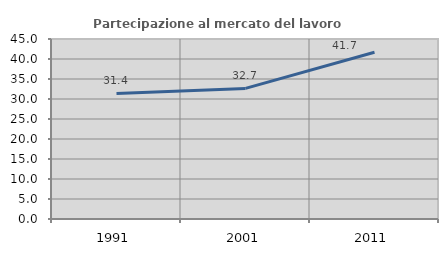
| Category | Partecipazione al mercato del lavoro  femminile |
|---|---|
| 1991.0 | 31.393 |
| 2001.0 | 32.655 |
| 2011.0 | 41.693 |